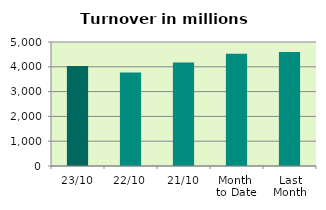
| Category | Series 0 |
|---|---|
| 23/10 | 4028.249 |
| 22/10 | 3768.586 |
| 21/10 | 4176.328 |
| Month 
to Date | 4525.92 |
| Last
Month | 4598.075 |